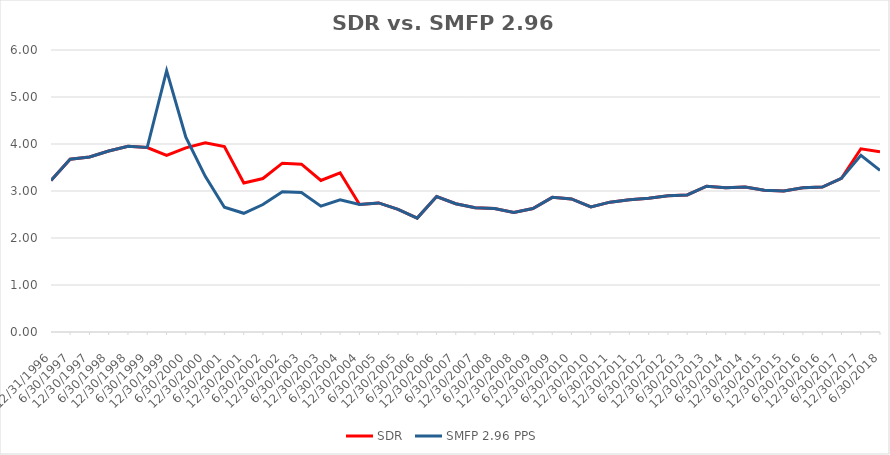
| Category | SDR | SMFP 2.96 PPS |
|---|---|---|
| 12/31/96 | 3.225 | 3.225 |
| 6/30/97 | 3.675 | 3.675 |
| 12/31/97 | 3.725 | 3.725 |
| 6/30/98 | 3.85 | 3.85 |
| 12/31/98 | 3.95 | 3.95 |
| 6/30/99 | 3.925 | 3.925 |
| 12/31/99 | 3.757 | 5.56 |
| 6/30/00 | 3.919 | 4.143 |
| 12/31/00 | 4.027 | 3.311 |
| 6/30/01 | 3.946 | 2.655 |
| 12/31/01 | 3.17 | 2.525 |
| 6/30/02 | 3.265 | 2.712 |
| 12/31/02 | 3.592 | 2.983 |
| 6/30/03 | 3.571 | 2.966 |
| 12/31/03 | 3.224 | 2.678 |
| 6/30/04 | 3.388 | 2.814 |
| 12/31/04 | 2.712 | 2.712 |
| 6/30/05 | 2.746 | 2.746 |
| 12/31/05 | 2.61 | 2.61 |
| 6/30/06 | 2.424 | 2.424 |
| 12/31/06 | 2.881 | 2.881 |
| 6/30/07 | 2.729 | 2.729 |
| 12/31/07 | 2.644 | 2.644 |
| 6/30/08 | 2.627 | 2.627 |
| 12/31/08 | 2.542 | 2.542 |
| 6/30/09 | 2.627 | 2.627 |
| 12/31/09 | 2.864 | 2.864 |
| 6/30/10 | 2.831 | 2.831 |
| 12/31/10 | 2.661 | 2.661 |
| 6/30/11 | 2.763 | 2.763 |
| 12/31/11 | 2.814 | 2.814 |
| 6/30/12 | 2.847 | 2.847 |
| 12/31/12 | 2.898 | 2.898 |
| 6/30/13 | 2.915 | 2.915 |
| 12/31/13 | 3.102 | 3.102 |
| 6/30/14 | 3.068 | 3.068 |
| 12/31/14 | 3.085 | 3.085 |
| 6/30/15 | 3.017 | 3.017 |
| 12/31/15 | 3 | 3 |
| 6/30/16 | 3.068 | 3.068 |
| 12/31/16 | 3.085 | 3.085 |
| 6/30/17 | 3.271 | 3.271 |
| 12/31/17 | 3.898 | 3.759 |
| 6/30/18 | 3.837 | 3.438 |